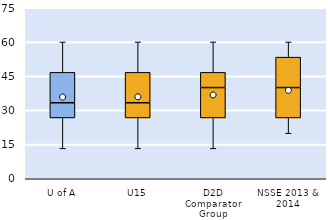
| Category | 25th | 50th | 75th |
|---|---|---|---|
| U of A | 26.667 | 6.667 | 13.333 |
| U15 | 26.667 | 6.667 | 13.333 |
| D2D Comparator Group | 26.667 | 13.333 | 6.667 |
| NSSE 2013 & 2014 | 26.667 | 13.333 | 13.333 |